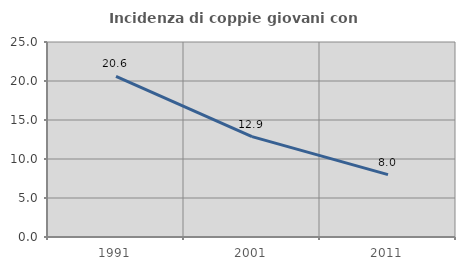
| Category | Incidenza di coppie giovani con figli |
|---|---|
| 1991.0 | 20.588 |
| 2001.0 | 12.865 |
| 2011.0 | 7.992 |